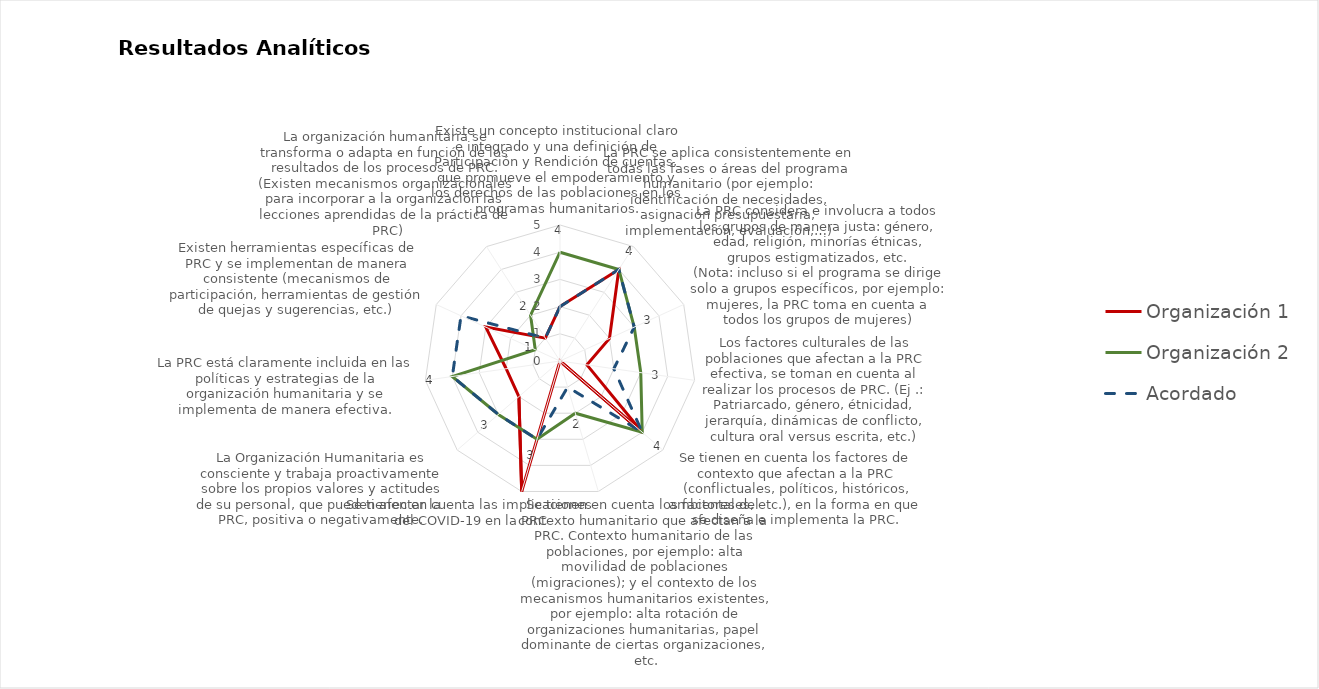
| Category | Organización 1 | Organización 2 | Acordado |
|---|---|---|---|
| Existe un concepto institucional claro e integrado y una definición de Participación y Rendición de cuentas, que promueve el empoderamiento y los derechos de las poblaciones en los programas humanitarios. | 2 | 4 | 2 |
| La PRC se aplica consistentemente en todas las fases o áreas del programa humanitario (por ejemplo: identificación de necesidades, asignación presupuestaria, implementación, evaluación,…) | 4 | 4 | 4 |
| La PRC considera e involucra a todos los grupos de manera justa: género, edad, religión, minorías étnicas, grupos estigmatizados, etc._x000d_(Nota: incluso si el programa se dirige solo a grupos específicos, por ejemplo: mujeres, la PRC toma en cuenta a todos l | 2 | 3 | 3 |
| Los factores culturales de las poblaciones que afectan a la PRC efectiva, se toman en cuenta al realizar los procesos de PRC. (Ej .: Patriarcado, género, étnicidad, jerarquía, dinámicas de conflicto, cultura oral versus escrita, etc.) | 1 | 3 | 2 |
| Se tienen en cuenta los factores de contexto que afectan a la PRC (conflictuales, políticos, históricos, ambientales, etc.), en la forma en que se diseña e implementa la PRC. | 4 | 4 | 4 |
| Se tienen en cuenta los factores del contexto humanitario que afectan a la PRC. Contexto humanitario de las poblaciones, por ejemplo: alta movilidad de poblaciones (migraciones); y el contexto de los mecanismos humanitarios existentes, por ejemplo: alta r | 0 | 2 | 1 |
| Se tienen en cuenta las implicaciones del COVID-19 en la PRC | 5 | 3 | 3 |
| La Organización Humanitaria es consciente y trabaja proactivamente sobre los propios valores y actitudes de su personal, que pueden afectar la PRC, positiva o negativamente. | 2 | 3 | 3 |
| La PRC está claramente incluida en las políticas y estrategias de la organización humanitaria y se implementa de manera efectiva. | 2 | 4 | 4 |
| Existen herramientas específicas de PRC y se implementan de manera consistente (mecanismos de participación, herramientas de gestión de quejas y sugerencias, etc.) | 3 | 1 | 4 |
| La organización humanitaria se transforma o adapta en función de los resultados de los procesos de PRC. (Existen mecanismos organizacionales para incorporar a la organización las lecciones aprendidas de la práctica de PRC) | 1 | 2 | 1 |